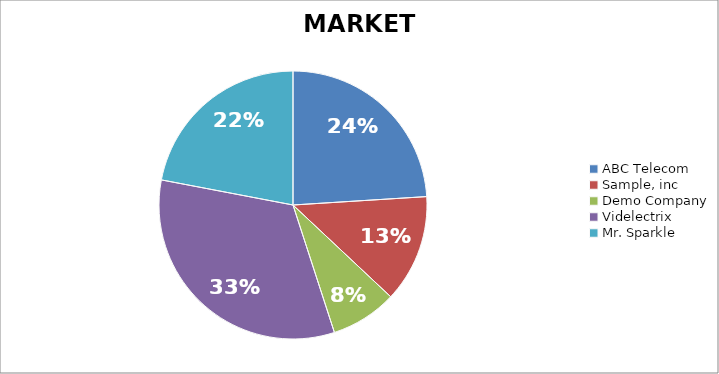
| Category | MARKET SHARE |
|---|---|
| ABC Telecom | 0.24 |
| Sample, inc | 0.13 |
| Demo Company | 0.08 |
| Videlectrix | 0.33 |
| Mr. Sparkle | 0.22 |